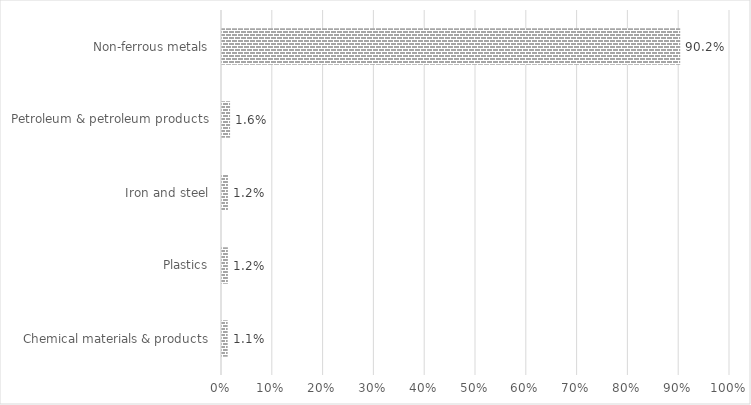
| Category | %Share |
|---|---|
| Chemical materials & products | 0.011 |
| Plastics | 0.012 |
| Iron and steel | 0.012 |
| Petroleum & petroleum products | 0.016 |
| Non-ferrous metals | 0.902 |